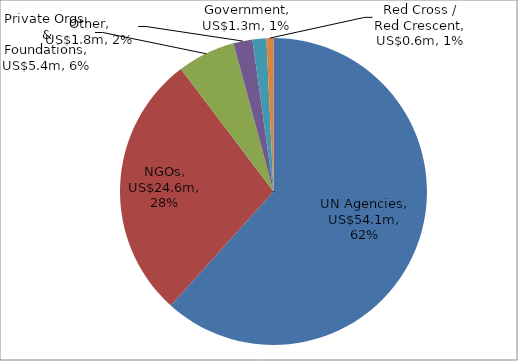
| Category | US$ millions |
|---|---|
| UN Agencies | 54.105 |
| NGOs | 24.585 |
| Private Orgs. & Foundations | 5.351 |
| Other | 1.764 |
| Government | 1.282 |
| Red Cross / Red Crescent | 0.644 |